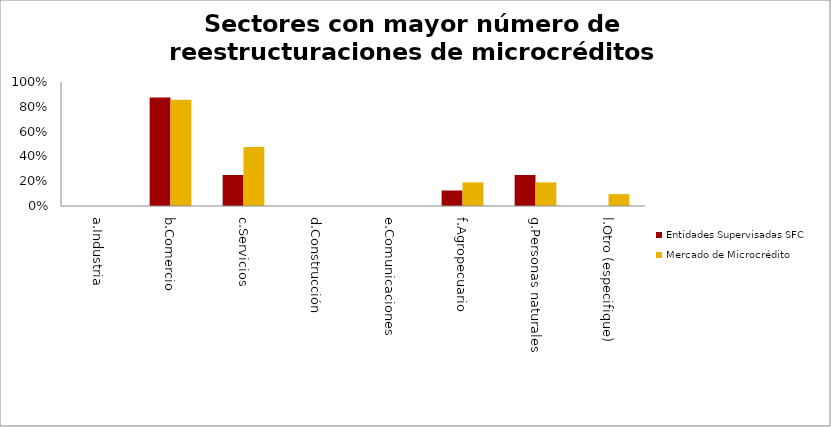
| Category | Entidades Supervisadas SFC | Mercado de Microcrédito |
|---|---|---|
| a.Industria | 0 | 0 |
| b.Comercio | 0.875 | 0.857 |
| c.Servicios | 0.25 | 0.476 |
| d.Construcción | 0 | 0 |
| e.Comunicaciones | 0 | 0 |
| f.Agropecuario | 0.125 | 0.19 |
| g.Personas naturales | 0.25 | 0.19 |
| l.Otro (especifique) | 0 | 0.095 |